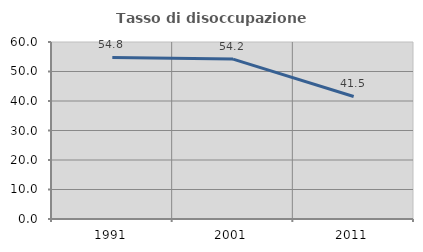
| Category | Tasso di disoccupazione giovanile  |
|---|---|
| 1991.0 | 54.777 |
| 2001.0 | 54.206 |
| 2011.0 | 41.538 |